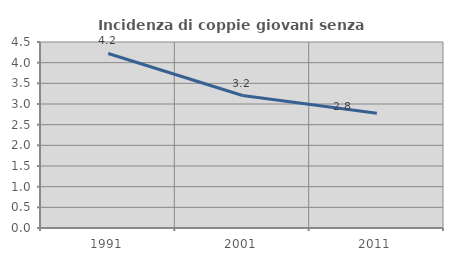
| Category | Incidenza di coppie giovani senza figli |
|---|---|
| 1991.0 | 4.222 |
| 2001.0 | 3.205 |
| 2011.0 | 2.778 |